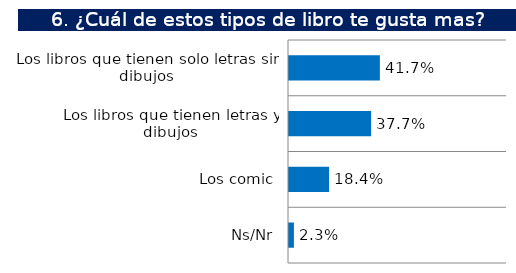
| Category | Series 0 |
|---|---|
| Los libros que tienen solo letras sin dibujos | 0.417 |
| Los libros que tienen letras y dibujos | 0.377 |
| Los comic | 0.184 |
| Ns/Nr | 0.023 |